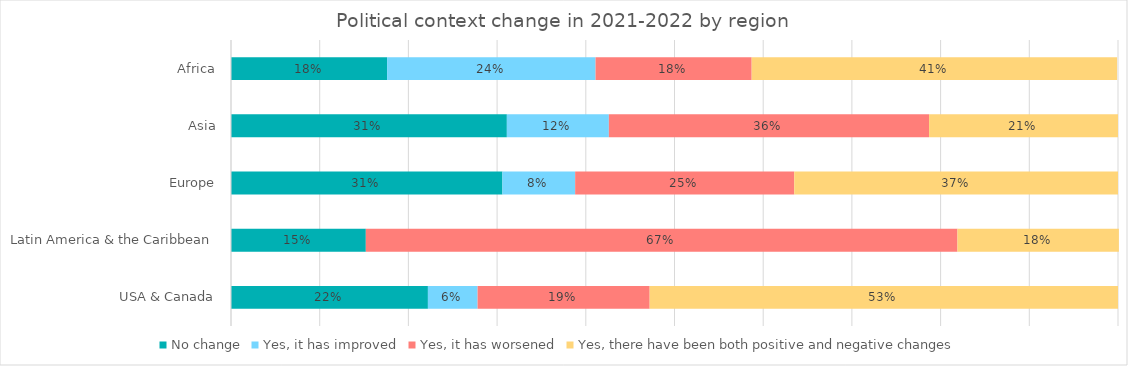
| Category | No change | Yes, it has improved | Yes, it has worsened | Yes, there have been both positive and negative changes |
|---|---|---|---|---|
| Africa | 0.176 | 0.235 | 0.176 | 0.412 |
| Asia | 0.311 | 0.115 | 0.361 | 0.213 |
| Europe | 0.306 | 0.082 | 0.247 | 0.365 |
| Latin America & the Caribbean | 0.152 | 0 | 0.667 | 0.182 |
| USA & Canada | 0.222 | 0.056 | 0.194 | 0.528 |